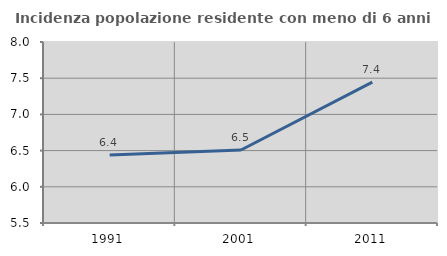
| Category | Incidenza popolazione residente con meno di 6 anni |
|---|---|
| 1991.0 | 6.439 |
| 2001.0 | 6.508 |
| 2011.0 | 7.445 |